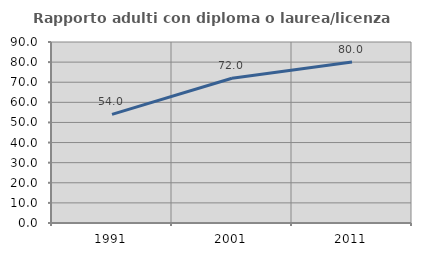
| Category | Rapporto adulti con diploma o laurea/licenza media  |
|---|---|
| 1991.0 | 54 |
| 2001.0 | 71.951 |
| 2011.0 | 80 |